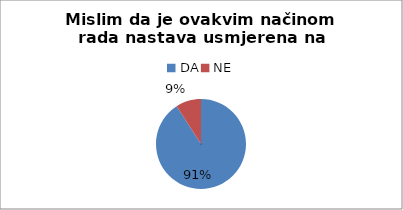
| Category | Series 0 |
|---|---|
| DA | 20 |
| NE | 2 |